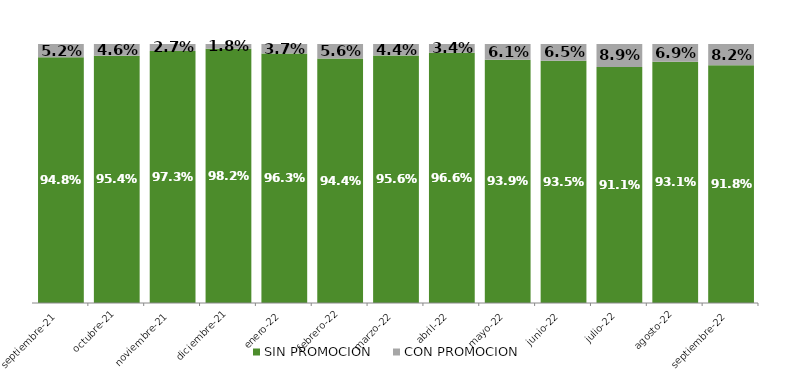
| Category | SIN PROMOCION   | CON PROMOCION   |
|---|---|---|
| 2021-09-01 | 0.948 | 0.052 |
| 2021-10-01 | 0.954 | 0.046 |
| 2021-11-01 | 0.973 | 0.027 |
| 2021-12-01 | 0.982 | 0.018 |
| 2022-01-01 | 0.963 | 0.037 |
| 2022-02-01 | 0.944 | 0.056 |
| 2022-03-01 | 0.956 | 0.044 |
| 2022-04-01 | 0.966 | 0.034 |
| 2022-05-01 | 0.939 | 0.061 |
| 2022-06-01 | 0.935 | 0.065 |
| 2022-07-01 | 0.911 | 0.089 |
| 2022-08-01 | 0.931 | 0.069 |
| 2022-09-01 | 0.918 | 0.082 |